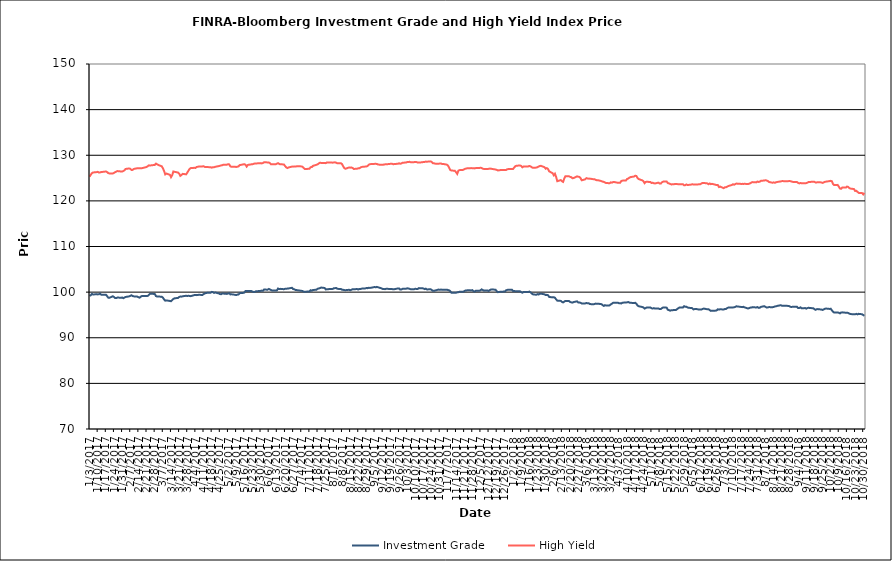
| Category | Investment Grade | High Yield |
|---|---|---|
| 1/3/17 | 99.167 | 125.29 |
| 1/4/17 | 99.324 | 125.718 |
| 1/5/17 | 99.629 | 126.08 |
| 1/6/17 | 99.465 | 126.222 |
| 1/9/17 | 99.562 | 126.301 |
| 1/10/17 | 99.502 | 126.358 |
| 1/11/17 | 99.52 | 126.215 |
| 1/12/17 | 99.682 | 126.236 |
| 1/13/17 | 99.426 | 126.315 |
| 1/17/17 | 99.431 | 126.442 |
| 1/18/17 | 99.159 | 126.34 |
| 1/19/17 | 98.789 | 126.091 |
| 1/20/17 | 98.753 | 126.016 |
| 1/23/17 | 99.094 | 125.997 |
| 1/24/17 | 98.935 | 126.138 |
| 1/25/17 | 98.694 | 126.299 |
| 1/26/17 | 98.686 | 126.427 |
| 1/27/17 | 98.832 | 126.533 |
| 1/30/17 | 98.744 | 126.442 |
| 1/31/17 | 98.822 | 126.428 |
| 2/1/17 | 98.666 | 126.54 |
| 2/2/17 | 98.834 | 126.71 |
| 2/3/17 | 98.938 | 126.997 |
| 2/6/17 | 99.073 | 127.105 |
| 2/7/17 | 99.167 | 127.032 |
| 2/8/17 | 99.313 | 126.779 |
| 2/9/17 | 99.148 | 126.792 |
| 2/10/17 | 99.072 | 127.001 |
| 2/13/17 | 99.019 | 127.148 |
| 2/14/17 | 98.891 | 127.17 |
| 2/15/17 | 98.774 | 127.135 |
| 2/16/17 | 99.017 | 127.143 |
| 2/17/17 | 99.152 | 127.164 |
| 2/21/17 | 99.158 | 127.417 |
| 2/22/17 | 99.179 | 127.596 |
| 2/23/17 | 99.392 | 127.788 |
| 2/24/17 | 99.66 | 127.755 |
| 2/27/17 | 99.612 | 127.849 |
| 2/28/17 | 99.611 | 127.865 |
| 3/1/17 | 99.147 | 128.167 |
| 3/2/17 | 99.036 | 128.03 |
| 3/3/17 | 99.029 | 127.88 |
| 3/6/17 | 98.999 | 127.582 |
| 3/7/17 | 98.792 | 127.155 |
| 3/8/17 | 98.418 | 126.57 |
| 3/9/17 | 98.122 | 125.801 |
| 3/10/17 | 98.185 | 125.997 |
| 3/13/17 | 98.066 | 125.711 |
| 3/14/17 | 98.01 | 125.195 |
| 3/15/17 | 98.242 | 125.611 |
| 3/16/17 | 98.512 | 126.437 |
| 3/17/17 | 98.636 | 126.374 |
| 3/20/17 | 98.731 | 126.207 |
| 3/21/17 | 98.926 | 125.972 |
| 3/22/17 | 99.036 | 125.486 |
| 3/23/17 | 99.008 | 125.659 |
| 3/24/17 | 99.092 | 125.92 |
| 3/27/17 | 99.203 | 125.816 |
| 3/28/17 | 99.135 | 126.205 |
| 3/29/17 | 99.22 | 126.619 |
| 3/30/17 | 99.134 | 127.017 |
| 3/31/17 | 99.12 | 127.191 |
| 4/3/17 | 99.352 | 127.242 |
| 4/4/17 | 99.346 | 127.214 |
| 4/5/17 | 99.341 | 127.433 |
| 4/6/17 | 99.373 | 127.467 |
| 4/7/17 | 99.424 | 127.55 |
| 4/10/17 | 99.36 | 127.557 |
| 4/11/17 | 99.58 | 127.584 |
| 4/12/17 | 99.7 | 127.45 |
| 4/13/17 | 99.828 | 127.43 |
| 4/17/17 | 99.864 | 127.372 |
| 4/18/17 | 100.048 | 127.28 |
| 4/19/17 | 99.994 | 127.383 |
| 4/20/17 | 99.833 | 127.38 |
| 4/21/17 | 99.919 | 127.467 |
| 4/24/17 | 99.724 | 127.614 |
| 4/25/17 | 99.581 | 127.691 |
| 4/26/17 | 99.546 | 127.769 |
| 4/27/17 | 99.683 | 127.81 |
| 4/28/17 | 99.68 | 127.918 |
| 5/1/17 | 99.61 | 127.928 |
| 5/2/17 | 99.679 | 128.036 |
| 5/3/17 | 99.773 | 127.994 |
| 5/4/17 | 99.494 | 127.57 |
| 5/5/17 | 99.528 | 127.458 |
| 5/8/17 | 99.422 | 127.476 |
| 5/9/17 | 99.348 | 127.426 |
| 5/10/17 | 99.464 | 127.493 |
| 5/11/17 | 99.465 | 127.549 |
| 5/12/17 | 99.771 | 127.84 |
| 5/15/17 | 99.83 | 127.994 |
| 5/16/17 | 99.908 | 128.044 |
| 5/17/17 | 100.232 | 127.918 |
| 5/18/17 | 100.236 | 127.513 |
| 5/19/17 | 100.22 | 127.878 |
| 5/22/17 | 100.234 | 128.008 |
| 5/23/17 | 100.12 | 128.02 |
| 5/24/17 | 100.026 | 128.117 |
| 5/25/17 | 100.058 | 128.192 |
| 5/26/17 | 100.179 | 128.198 |
| 5/30/17 | 100.268 | 128.276 |
| 5/31/17 | 100.336 | 128.216 |
| 6/1/17 | 100.29 | 128.298 |
| 6/2/17 | 100.573 | 128.473 |
| 6/5/17 | 100.532 | 128.426 |
| 6/6/17 | 100.701 | 128.409 |
| 6/7/17 | 100.598 | 128.271 |
| 6/8/17 | 100.441 | 128.001 |
| 6/9/17 | 100.364 | 128.01 |
| 6/12/17 | 100.371 | 128.036 |
| 6/13/17 | 100.379 | 128.163 |
| 6/14/17 | 100.791 | 128.27 |
| 6/15/17 | 100.673 | 128.1 |
| 6/16/17 | 100.717 | 128.006 |
| 6/19/17 | 100.641 | 127.995 |
| 6/20/17 | 100.724 | 127.654 |
| 6/21/17 | 100.732 | 127.349 |
| 6/22/17 | 100.78 | 127.197 |
| 6/23/17 | 100.807 | 127.322 |
| 6/26/17 | 100.948 | 127.512 |
| 6/27/17 | 100.676 | 127.503 |
| 6/28/17 | 100.616 | 127.544 |
| 6/29/17 | 100.472 | 127.522 |
| 6/30/17 | 100.444 | 127.575 |
| 7/3/17 | 100.327 | 127.582 |
| 7/5/17 | 100.249 | 127.495 |
| 7/6/17 | 100.103 | 127.207 |
| 7/7/17 | 100.053 | 126.98 |
| 7/10/17 | 100.159 | 127.021 |
| 7/11/17 | 100.16 | 127.037 |
| 7/12/17 | 100.413 | 127.393 |
| 7/13/17 | 100.316 | 127.41 |
| 7/14/17 | 100.475 | 127.671 |
| 7/17/17 | 100.512 | 127.906 |
| 7/18/17 | 100.747 | 128.014 |
| 7/19/17 | 100.793 | 128.2 |
| 7/20/17 | 100.882 | 128.363 |
| 7/21/17 | 101.003 | 128.319 |
| 7/24/17 | 100.907 | 128.32 |
| 7/25/17 | 100.593 | 128.264 |
| 7/26/17 | 100.617 | 128.423 |
| 7/27/17 | 100.612 | 128.402 |
| 7/28/17 | 100.698 | 128.427 |
| 7/31/17 | 100.712 | 128.375 |
| 8/1/17 | 100.858 | 128.429 |
| 8/2/17 | 100.869 | 128.446 |
| 8/3/17 | 100.91 | 128.372 |
| 8/4/17 | 100.719 | 128.226 |
| 8/7/17 | 100.69 | 128.247 |
| 8/8/17 | 100.529 | 128.057 |
| 8/9/17 | 100.501 | 127.577 |
| 8/10/17 | 100.444 | 127.161 |
| 8/11/17 | 100.428 | 127.045 |
| 8/14/17 | 100.51 | 127.316 |
| 8/15/17 | 100.408 | 127.277 |
| 8/16/17 | 100.511 | 127.325 |
| 8/17/17 | 100.625 | 127.225 |
| 8/18/17 | 100.649 | 126.998 |
| 8/21/17 | 100.662 | 127.05 |
| 8/22/17 | 100.58 | 127.155 |
| 8/23/17 | 100.707 | 127.154 |
| 8/24/17 | 100.702 | 127.322 |
| 8/25/17 | 100.766 | 127.444 |
| 8/28/17 | 100.811 | 127.519 |
| 8/29/17 | 100.91 | 127.551 |
| 8/30/17 | 100.866 | 127.652 |
| 8/31/17 | 100.955 | 127.923 |
| 9/1/17 | 100.918 | 128.046 |
| 9/5/17 | 101.116 | 128.11 |
| 9/6/17 | 101.064 | 128.114 |
| 9/7/17 | 101.148 | 128.098 |
| 9/8/17 | 101.061 | 127.96 |
| 9/11/17 | 100.823 | 127.908 |
| 9/12/17 | 100.676 | 127.893 |
| 9/13/17 | 100.664 | 127.977 |
| 9/14/17 | 100.655 | 128.006 |
| 9/15/17 | 100.738 | 128.012 |
| 9/18/17 | 100.691 | 128.097 |
| 9/19/17 | 100.71 | 128.152 |
| 9/20/17 | 100.669 | 128.143 |
| 9/21/17 | 100.604 | 128.023 |
| 9/22/17 | 100.65 | 128.083 |
| 9/25/17 | 100.805 | 128.129 |
| 9/26/17 | 100.807 | 128.234 |
| 9/27/17 | 100.562 | 128.132 |
| 9/28/17 | 100.593 | 128.209 |
| 9/29/17 | 100.721 | 128.376 |
| 10/2/17 | 100.746 | 128.389 |
| 10/3/17 | 100.834 | 128.512 |
| 10/4/17 | 100.794 | 128.503 |
| 10/5/17 | 100.73 | 128.568 |
| 10/6/17 | 100.629 | 128.471 |
| 10/9/17 | 100.645 | 128.493 |
| 10/10/17 | 100.736 | 128.533 |
| 10/11/17 | 100.693 | 128.507 |
| 10/12/17 | 100.668 | 128.408 |
| 10/13/17 | 100.881 | 128.399 |
| 10/16/17 | 100.84 | 128.461 |
| 10/17/17 | 100.795 | 128.526 |
| 10/18/17 | 100.661 | 128.534 |
| 10/19/17 | 100.761 | 128.61 |
| 10/20/17 | 100.579 | 128.587 |
| 10/23/17 | 100.646 | 128.657 |
| 10/24/17 | 100.499 | 128.553 |
| 10/25/17 | 100.282 | 128.267 |
| 10/26/17 | 100.274 | 128.238 |
| 10/27/17 | 100.354 | 128.165 |
| 10/30/17 | 100.557 | 128.146 |
| 10/31/17 | 100.509 | 128.181 |
| 11/1/17 | 100.558 | 128.202 |
| 11/2/17 | 100.534 | 128.091 |
| 11/3/17 | 100.544 | 128.096 |
| 11/6/17 | 100.546 | 127.944 |
| 11/7/17 | 100.462 | 127.761 |
| 11/8/17 | 100.402 | 127.309 |
| 11/9/17 | 100.215 | 126.763 |
| 11/10/17 | 99.868 | 126.665 |
| 11/13/17 | 99.862 | 126.59 |
| 11/14/17 | 99.872 | 126.281 |
| 11/15/17 | 99.956 | 125.912 |
| 11/16/17 | 99.994 | 126.616 |
| 11/17/17 | 100.092 | 126.74 |
| 11/20/17 | 100.053 | 126.791 |
| 11/21/17 | 100.208 | 126.93 |
| 11/22/17 | 100.355 | 127.049 |
| 11/24/17 | 100.398 | 127.165 |
| 11/27/17 | 100.38 | 127.179 |
| 11/28/17 | 100.434 | 127.171 |
| 11/29/17 | 100.207 | 127.16 |
| 11/30/17 | 100.115 | 127.119 |
| 12/1/17 | 100.319 | 127.199 |
| 12/4/17 | 100.297 | 127.193 |
| 12/5/17 | 100.413 | 127.273 |
| 12/6/17 | 100.604 | 127.188 |
| 12/7/17 | 100.463 | 127.047 |
| 12/8/17 | 100.326 | 126.989 |
| 12/11/17 | 100.36 | 126.978 |
| 12/12/17 | 100.255 | 127.021 |
| 12/13/17 | 100.446 | 127.08 |
| 12/14/17 | 100.569 | 127.054 |
| 12/15/17 | 100.606 | 127 |
| 12/18/17 | 100.509 | 126.871 |
| 12/19/17 | 100.19 | 126.797 |
| 12/20/17 | 99.99 | 126.652 |
| 12/21/17 | 100.044 | 126.725 |
| 12/22/17 | 100.072 | 126.741 |
| 12/26/17 | 100.134 | 126.789 |
| 12/27/17 | 100.395 | 126.782 |
| 12/28/17 | 100.493 | 126.924 |
| 12/29/17 | 100.537 | 126.974 |
| 1/1/18 | 100.537 | 126.974 |
| 1/2/18 | 100.218 | 126.984 |
| 1/3/18 | 100.268 | 127.319 |
| 1/4/18 | 100.188 | 127.603 |
| 1/5/18 | 100.176 | 127.707 |
| 1/8/18 | 100.175 | 127.753 |
| 1/9/18 | 99.997 | 127.66 |
| 1/10/18 | 99.876 | 127.356 |
| 1/11/18 | 100.024 | 127.529 |
| 1/12/18 | 100.019 | 127.554 |
| 1/15/18 | 100.019 | 127.554 |
| 1/16/18 | 100.114 | 127.649 |
| 1/17/18 | 99.954 | 127.559 |
| 1/18/18 | 99.711 | 127.378 |
| 1/19/18 | 99.521 | 127.254 |
| 1/22/18 | 99.421 | 127.293 |
| 1/23/18 | 99.569 | 127.385 |
| 1/24/18 | 99.475 | 127.518 |
| 1/25/18 | 99.663 | 127.666 |
| 1/26/18 | 99.667 | 127.674 |
| 1/29/18 | 99.521 | 127.386 |
| 1/30/18 | 99.357 | 127.055 |
| 1/31/18 | 99.406 | 127.186 |
| 2/1/18 | 99.331 | 127.002 |
| 2/2/18 | 98.946 | 126.474 |
| 2/5/18 | 98.848 | 126.072 |
| 2/6/18 | 98.866 | 125.608 |
| 2/7/18 | 98.778 | 125.949 |
| 2/8/18 | 98.402 | 125.264 |
| 2/9/18 | 98.137 | 124.312 |
| 2/12/18 | 98.076 | 124.558 |
| 2/13/18 | 97.881 | 124.308 |
| 2/14/18 | 97.742 | 124.16 |
| 2/15/18 | 97.923 | 124.893 |
| 2/16/18 | 98.076 | 125.398 |
| 2/19/18 | 98.076 | 125.398 |
| 2/20/18 | 97.854 | 125.264 |
| 2/21/18 | 97.764 | 125.204 |
| 2/22/18 | 97.701 | 124.966 |
| 2/23/18 | 97.817 | 124.998 |
| 2/26/18 | 97.984 | 125.373 |
| 2/27/18 | 97.73 | 125.297 |
| 2/28/18 | 97.712 | 125.253 |
| 3/1/18 | 97.674 | 124.982 |
| 3/2/18 | 97.518 | 124.511 |
| 3/5/18 | 97.523 | 124.718 |
| 3/6/18 | 97.619 | 124.991 |
| 3/7/18 | 97.553 | 124.896 |
| 3/8/18 | 97.574 | 124.874 |
| 3/9/18 | 97.381 | 124.877 |
| 3/12/18 | 97.342 | 124.746 |
| 3/13/18 | 97.388 | 124.743 |
| 3/14/18 | 97.487 | 124.609 |
| 3/15/18 | 97.449 | 124.523 |
| 3/16/18 | 97.465 | 124.528 |
| 3/19/18 | 97.363 | 124.329 |
| 3/20/18 | 97.144 | 124.215 |
| 3/21/18 | 96.973 | 124.166 |
| 3/22/18 | 97.144 | 124.042 |
| 3/23/18 | 97.058 | 123.905 |
| 3/26/18 | 97.096 | 123.879 |
| 3/27/18 | 97.323 | 124.056 |
| 3/28/18 | 97.472 | 123.988 |
| 3/29/18 | 97.665 | 124.127 |
| 3/30/18 | 97.665 | 124.127 |
| 4/2/18 | 97.687 | 123.974 |
| 4/3/18 | 97.572 | 123.977 |
| 4/4/18 | 97.575 | 123.957 |
| 4/5/18 | 97.518 | 124.356 |
| 4/6/18 | 97.683 | 124.435 |
| 4/9/18 | 97.734 | 124.477 |
| 4/10/18 | 97.76 | 124.791 |
| 4/11/18 | 97.828 | 124.906 |
| 4/12/18 | 97.697 | 125.091 |
| 4/13/18 | 97.666 | 125.211 |
| 4/16/18 | 97.601 | 125.337 |
| 4/17/18 | 97.666 | 125.504 |
| 4/18/18 | 97.456 | 125.452 |
| 4/19/18 | 97.066 | 125.011 |
| 4/20/18 | 96.908 | 124.777 |
| 4/23/18 | 96.74 | 124.502 |
| 4/24/18 | 96.646 | 124.326 |
| 4/25/18 | 96.397 | 123.893 |
| 4/26/18 | 96.524 | 124.153 |
| 4/27/18 | 96.634 | 124.181 |
| 4/30/18 | 96.654 | 124.142 |
| 5/1/18 | 96.458 | 123.908 |
| 5/2/18 | 96.409 | 123.972 |
| 5/3/18 | 96.486 | 123.865 |
| 5/4/18 | 96.403 | 123.816 |
| 5/7/18 | 96.41 | 123.999 |
| 5/8/18 | 96.298 | 123.798 |
| 5/9/18 | 96.299 | 123.794 |
| 5/10/18 | 96.499 | 124.084 |
| 5/11/18 | 96.636 | 124.22 |
| 5/14/18 | 96.601 | 124.237 |
| 5/15/18 | 96.133 | 123.896 |
| 5/16/18 | 96.064 | 123.826 |
| 5/17/18 | 95.938 | 123.717 |
| 5/18/18 | 96.03 | 123.604 |
| 5/21/18 | 96.075 | 123.679 |
| 5/22/18 | 96.076 | 123.714 |
| 5/23/18 | 96.278 | 123.683 |
| 5/24/18 | 96.467 | 123.644 |
| 5/25/18 | 96.627 | 123.662 |
| 5/28/18 | 96.627 | 123.662 |
| 5/29/18 | 96.916 | 123.432 |
| 5/30/18 | 96.788 | 123.45 |
| 5/31/18 | 96.814 | 123.608 |
| 6/1/18 | 96.622 | 123.474 |
| 6/4/18 | 96.503 | 123.569 |
| 6/5/18 | 96.488 | 123.644 |
| 6/6/18 | 96.205 | 123.591 |
| 6/7/18 | 96.286 | 123.608 |
| 6/8/18 | 96.32 | 123.582 |
| 6/11/18 | 96.176 | 123.629 |
| 6/12/18 | 96.167 | 123.656 |
| 6/13/18 | 96.185 | 123.833 |
| 6/14/18 | 96.317 | 123.932 |
| 6/15/18 | 96.397 | 123.923 |
| 6/18/18 | 96.234 | 123.831 |
| 6/19/18 | 96.253 | 123.647 |
| 6/20/18 | 96.068 | 123.81 |
| 6/21/18 | 95.883 | 123.67 |
| 6/22/18 | 95.926 | 123.729 |
| 6/25/18 | 95.944 | 123.54 |
| 6/26/18 | 95.99 | 123.454 |
| 6/27/18 | 96.23 | 123.478 |
| 6/28/18 | 96.166 | 123.024 |
| 6/29/18 | 96.26 | 123.138 |
| 7/2/18 | 96.172 | 122.778 |
| 7/3/18 | 96.313 | 122.97 |
| 7/4/18 | 96.313 | 122.97 |
| 7/5/18 | 96.494 | 123.121 |
| 7/6/18 | 96.619 | 123.25 |
| 7/9/18 | 96.626 | 123.479 |
| 7/10/18 | 96.643 | 123.639 |
| 7/11/18 | 96.673 | 123.554 |
| 7/12/18 | 96.762 | 123.673 |
| 7/13/18 | 96.887 | 123.787 |
| 7/16/18 | 96.789 | 123.757 |
| 7/17/18 | 96.741 | 123.697 |
| 7/18/18 | 96.711 | 123.732 |
| 7/19/18 | 96.784 | 123.717 |
| 7/20/18 | 96.659 | 123.74 |
| 7/23/18 | 96.408 | 123.68 |
| 7/24/18 | 96.51 | 123.779 |
| 7/25/18 | 96.604 | 123.867 |
| 7/26/18 | 96.622 | 124.058 |
| 7/27/18 | 96.71 | 124.114 |
| 7/30/18 | 96.628 | 124.055 |
| 7/31/18 | 96.734 | 124.241 |
| 8/1/18 | 96.55 | 124.151 |
| 8/2/18 | 96.568 | 124.196 |
| 8/3/18 | 96.77 | 124.388 |
| 8/6/18 | 96.914 | 124.467 |
| 8/7/18 | 96.756 | 124.529 |
| 8/8/18 | 96.618 | 124.456 |
| 8/9/18 | 96.662 | 124.354 |
| 8/10/18 | 96.722 | 124.139 |
| 8/13/18 | 96.688 | 123.977 |
| 8/14/18 | 96.747 | 124.064 |
| 8/15/18 | 96.858 | 123.967 |
| 8/16/18 | 96.892 | 124.08 |
| 8/17/18 | 96.975 | 124.142 |
| 8/20/18 | 97.131 | 124.262 |
| 8/21/18 | 97.034 | 124.325 |
| 8/22/18 | 97.03 | 124.341 |
| 8/23/18 | 97.03 | 124.291 |
| 8/24/18 | 97.01 | 124.3 |
| 8/27/18 | 96.97 | 124.332 |
| 8/28/18 | 96.837 | 124.338 |
| 8/29/18 | 96.748 | 124.268 |
| 8/30/18 | 96.772 | 124.191 |
| 8/31/18 | 96.793 | 124.142 |
| 9/3/18 | 96.793 | 124.142 |
| 9/4/18 | 96.501 | 123.94 |
| 9/5/18 | 96.504 | 123.836 |
| 9/6/18 | 96.67 | 123.913 |
| 9/7/18 | 96.443 | 123.873 |
| 9/10/18 | 96.502 | 123.873 |
| 9/11/18 | 96.38 | 123.891 |
| 9/12/18 | 96.5 | 123.983 |
| 9/13/18 | 96.585 | 124.144 |
| 9/14/18 | 96.507 | 124.156 |
| 9/17/18 | 96.48 | 124.18 |
| 9/18/18 | 96.265 | 124.176 |
| 9/19/18 | 96.12 | 124.03 |
| 9/20/18 | 96.264 | 124.051 |
| 9/21/18 | 96.28 | 124.092 |
| 9/24/18 | 96.179 | 124.045 |
| 9/25/18 | 96.096 | 123.937 |
| 9/26/18 | 96.225 | 124.043 |
| 9/27/18 | 96.341 | 124.163 |
| 9/28/18 | 96.402 | 124.215 |
| 10/1/18 | 96.317 | 124.334 |
| 10/2/18 | 96.369 | 124.39 |
| 10/3/18 | 96.016 | 124.315 |
| 10/4/18 | 95.705 | 123.711 |
| 10/5/18 | 95.514 | 123.468 |
| 10/8/18 | 95.545 | 123.505 |
| 10/9/18 | 95.478 | 123.112 |
| 10/10/18 | 95.343 | 122.696 |
| 10/11/18 | 95.539 | 122.657 |
| 10/12/18 | 95.567 | 122.94 |
| 10/15/18 | 95.479 | 122.906 |
| 10/16/18 | 95.494 | 123.137 |
| 10/17/18 | 95.435 | 123.065 |
| 10/18/18 | 95.291 | 122.803 |
| 10/19/18 | 95.19 | 122.692 |
| 10/22/18 | 95.146 | 122.594 |
| 10/23/18 | 95.139 | 122.174 |
| 10/24/18 | 95.237 | 122.22 |
| 10/25/18 | 95.12 | 121.992 |
| 10/26/18 | 95.239 | 121.752 |
| 10/29/18 | 95.152 | 121.713 |
| 10/30/18 | 94.969 | 121.42 |
| 10/31/18 | 94.835 | 121.757 |